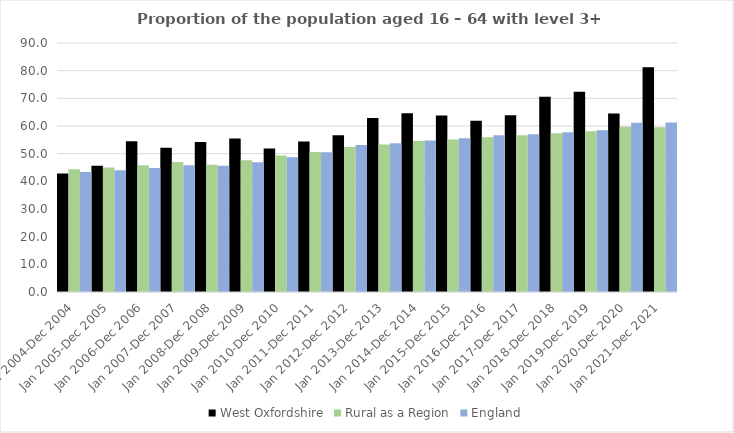
| Category | West Oxfordshire | Rural as a Region | England |
|---|---|---|---|
| Jan 2004-Dec 2004 | 42.8 | 44.405 | 43.4 |
| Jan 2005-Dec 2005 | 45.6 | 44.973 | 44 |
| Jan 2006-Dec 2006 | 54.5 | 45.774 | 44.8 |
| Jan 2007-Dec 2007 | 52.1 | 46.968 | 45.8 |
| Jan 2008-Dec 2008 | 54.2 | 45.964 | 45.6 |
| Jan 2009-Dec 2009 | 55.5 | 47.59 | 46.9 |
| Jan 2010-Dec 2010 | 51.9 | 49.362 | 48.7 |
| Jan 2011-Dec 2011 | 54.4 | 50.602 | 50.5 |
| Jan 2012-Dec 2012 | 56.7 | 52.439 | 53.1 |
| Jan 2013-Dec 2013 | 62.9 | 53.276 | 53.8 |
| Jan 2014-Dec 2014 | 64.6 | 54.57 | 54.8 |
| Jan 2015-Dec 2015 | 63.8 | 55.16 | 55.6 |
| Jan 2016-Dec 2016 | 61.9 | 55.941 | 56.7 |
| Jan 2017-Dec 2017 | 63.9 | 56.689 | 57 |
| Jan 2018-Dec 2018 | 70.6 | 57.389 | 57.7 |
| Jan 2019-Dec 2019 | 72.4 | 58.147 | 58.5 |
| Jan 2020-Dec 2020 | 64.5 | 59.771 | 61.2 |
| Jan 2021-Dec 2021 | 81.2 | 59.54 | 61.3 |